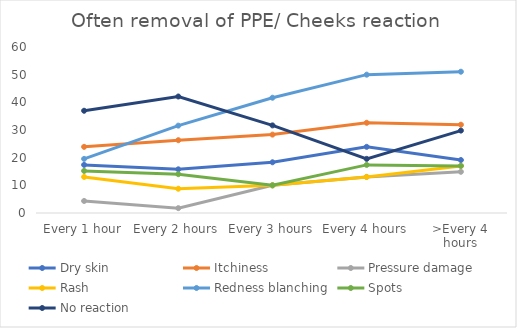
| Category | Dry skin | Itchiness | Pressure damage | Rash | Redness blanching | Spots | No reaction |
|---|---|---|---|---|---|---|---|
| Every 1 hour | 17.391 | 23.913 | 4.348 | 13.043 | 19.565 | 15.217 | 36.957 |
| Every 2 hours | 15.789 | 26.316 | 1.754 | 8.772 | 31.579 | 14.035 | 42.105 |
| Every 3 hours | 18.333 | 28.333 | 10 | 10 | 41.667 | 10 | 31.667 |
| Every 4 hours | 23.913 | 32.609 | 13.043 | 13.043 | 50 | 17.391 | 19.565 |
| >Every 4 hours | 19.149 | 31.915 | 14.894 | 17.021 | 51.064 | 17.021 | 29.787 |